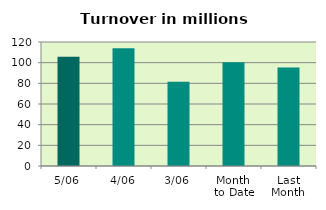
| Category | Series 0 |
|---|---|
| 5/06 | 105.728 |
| 4/06 | 113.89 |
| 3/06 | 81.595 |
| Month 
to Date | 100.404 |
| Last
Month | 95.269 |